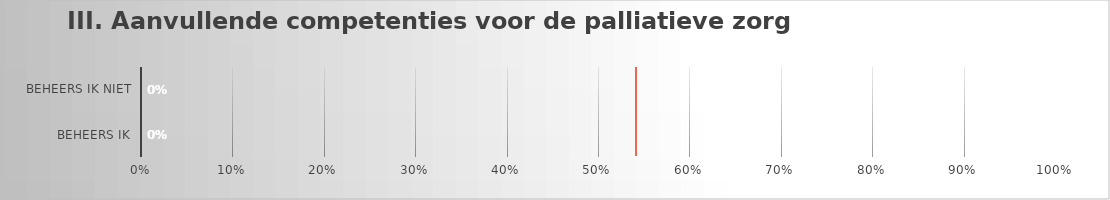
| Category | Competenties in de palliatieve zorg |
|---|---|
| Beheers ik | 0 |
| Beheers ik niet | 0 |